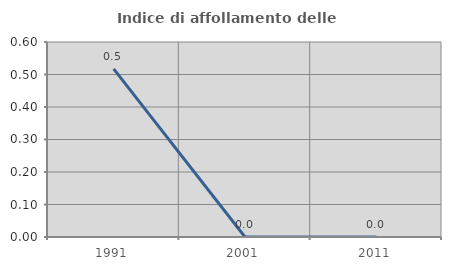
| Category | Indice di affollamento delle abitazioni  |
|---|---|
| 1991.0 | 0.517 |
| 2001.0 | 0 |
| 2011.0 | 0 |